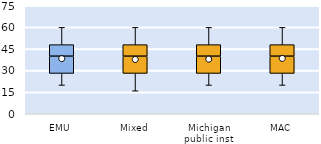
| Category | 25th | 50th | 75th |
|---|---|---|---|
| EMU | 28 | 12 | 8 |
| Mixed | 28 | 12 | 8 |
| Michigan public inst | 28 | 12 | 8 |
| MAC | 28 | 12 | 8 |